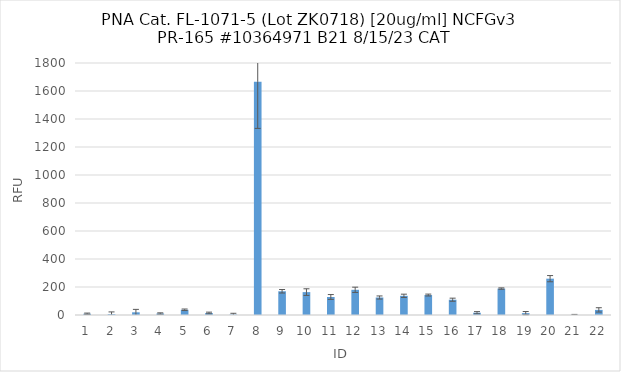
| Category | RFU |
|---|---|
| 0 | 9 |
| 1 | 5.75 |
| 2 | 19.25 |
| 3 | 10.5 |
| 4 | 37.25 |
| 5 | 14.25 |
| 6 | 3.25 |
| 7 | 1665.5 |
| 8 | 169.5 |
| 9 | 163.5 |
| 10 | 128.75 |
| 11 | 180 |
| 12 | 125 |
| 13 | 137 |
| 14 | 142.5 |
| 15 | 109.25 |
| 16 | 16.25 |
| 17 | 188.75 |
| 18 | 13.25 |
| 19 | 259.5 |
| 20 | 1.25 |
| 21 | 36.5 |